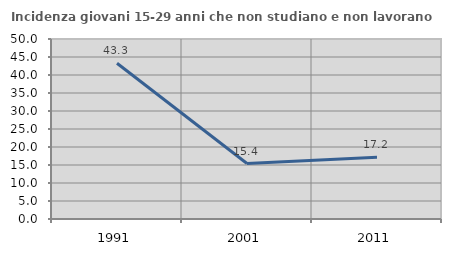
| Category | Incidenza giovani 15-29 anni che non studiano e non lavorano  |
|---|---|
| 1991.0 | 43.277 |
| 2001.0 | 15.401 |
| 2011.0 | 17.166 |